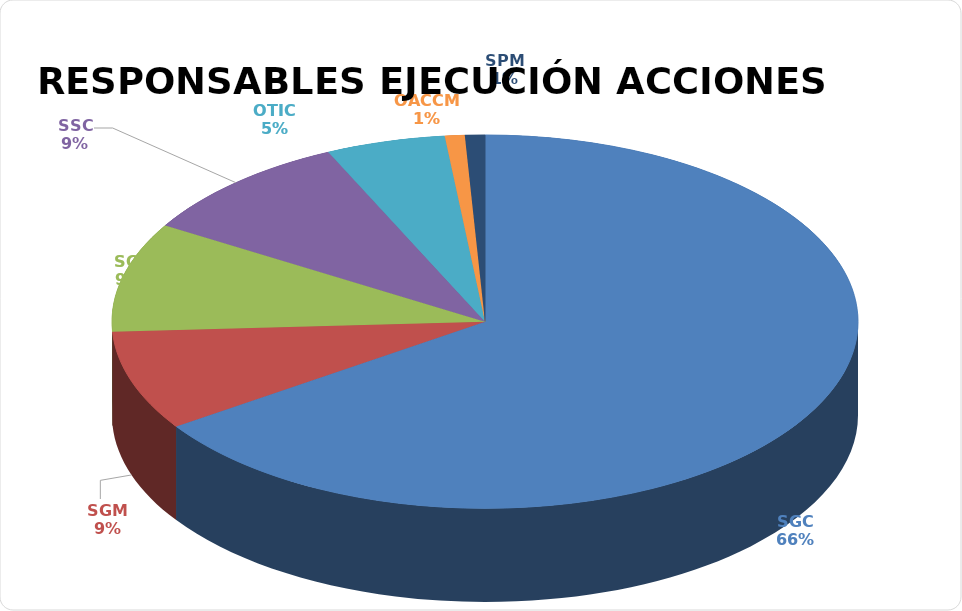
| Category | Series 0 |
|---|---|
| SGC | 76 |
| SGM | 10 |
| SGJ | 11 |
| SSC | 11 |
| OTIC | 6 |
| OACCM | 1 |
| SPM | 1 |